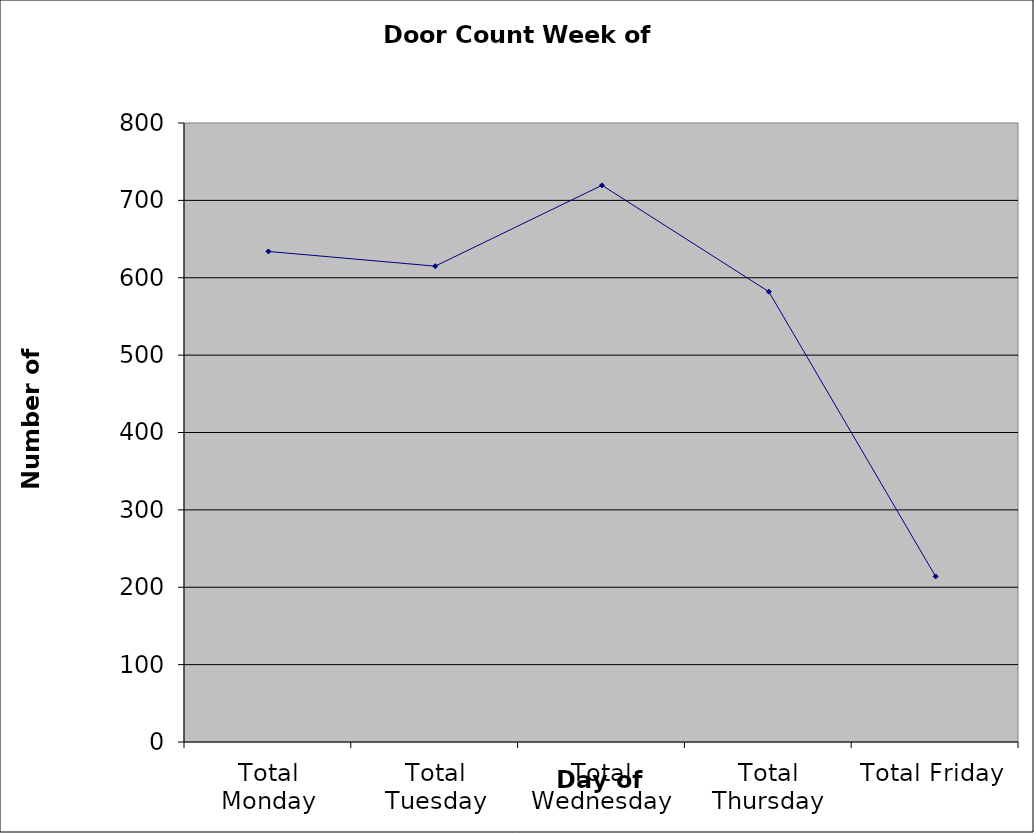
| Category | Series 0 |
|---|---|
| Total Monday | 634 |
| Total Tuesday | 615 |
| Total Wednesday | 719.5 |
| Total Thursday | 582 |
| Total Friday | 214 |